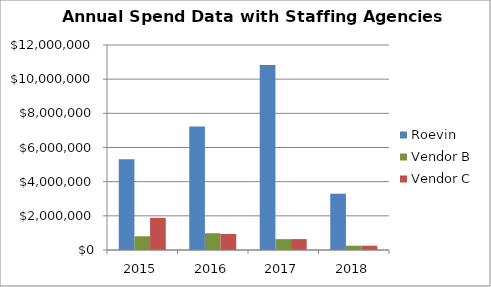
| Category | Roevin  | Vendor B | Vendor C |
|---|---|---|---|
| 2015.0 | 5306331.57 | 802076.26 | 1880722.08 |
| 2016.0 | 7222911.42 | 981248.65 | 940204.61 |
| 2017.0 | 10822998.08 | 635047.41 | 637539.8 |
| 2018.0 | 3294707.62 | 250697.51 | 251536.43 |